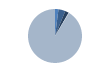
| Category | Series 0 |
|---|---|
| ARRASTRE | 23 |
| CERCO | 46 |
| PALANGRE | 25 |
| REDES DE ENMALLE | 3 |
| ARTES MENORES | 1012 |
| SIN TIPO ASIGNADO | 0 |